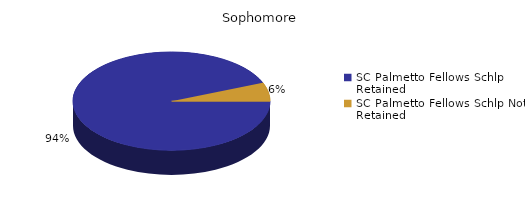
| Category | Sophomore |
|---|---|
| SC Palmetto Fellows Schlp Retained  | 507 |
| SC Palmetto Fellows Schlp Not Retained  | 33 |